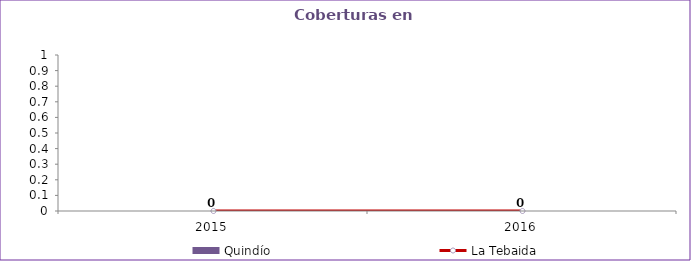
| Category | Quindío |
|---|---|
| 2015.0 | 0 |
| 2016.0 | 0 |